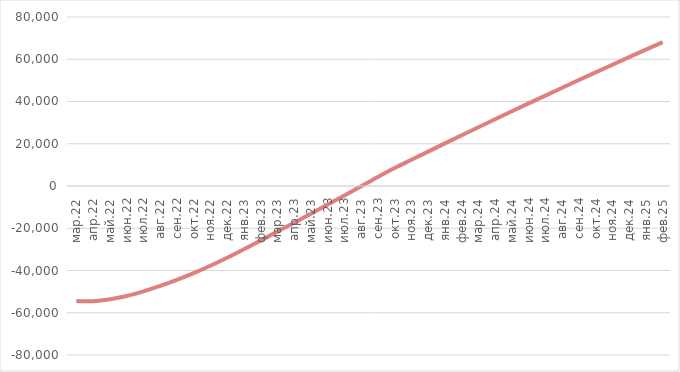
| Category | Дисконтированный поток нарастающим итогом |
|---|---|
| мар.22 | -54475 |
| апр.22 | -54545.099 |
| май.22 | -53627.839 |
| июн.22 | -52070.638 |
| июл.22 | -49881.177 |
| авг.22 | -47297.385 |
| сен.22 | -44412.574 |
| окт.22 | -41230.491 |
| ноя.22 | -37754.905 |
| дек.22 | -33989.553 |
| янв.23 | -29938.132 |
| фев.23 | -25781.681 |
| мар.23 | -21589.773 |
| апр.23 | -17362.959 |
| май.23 | -13101.827 |
| июн.23 | -8806.96 |
| июл.23 | -4478.935 |
| авг.23 | -118.323 |
| сен.23 | 4274.311 |
| окт.23 | 8484.42 |
| ноя.23 | 12396.727 |
| дек.23 | 16290.953 |
| янв.24 | 20156.058 |
| фев.24 | 23995.131 |
| мар.24 | 27808.375 |
| апр.24 | 31595.964 |
| май.24 | 35358.068 |
| июн.24 | 39094.859 |
| июл.24 | 42806.505 |
| авг.24 | 46493.174 |
| сен.24 | 50155.032 |
| окт.24 | 53792.247 |
| ноя.24 | 57404.982 |
| дек.24 | 60993.4 |
| янв.25 | 64557.665 |
| фев.25 | 68097.938 |